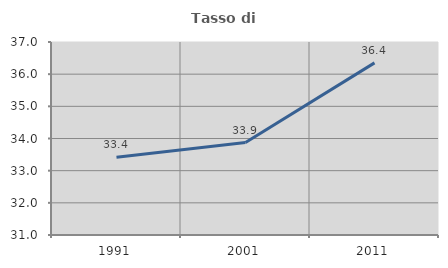
| Category | Tasso di occupazione   |
|---|---|
| 1991.0 | 33.416 |
| 2001.0 | 33.875 |
| 2011.0 | 36.351 |